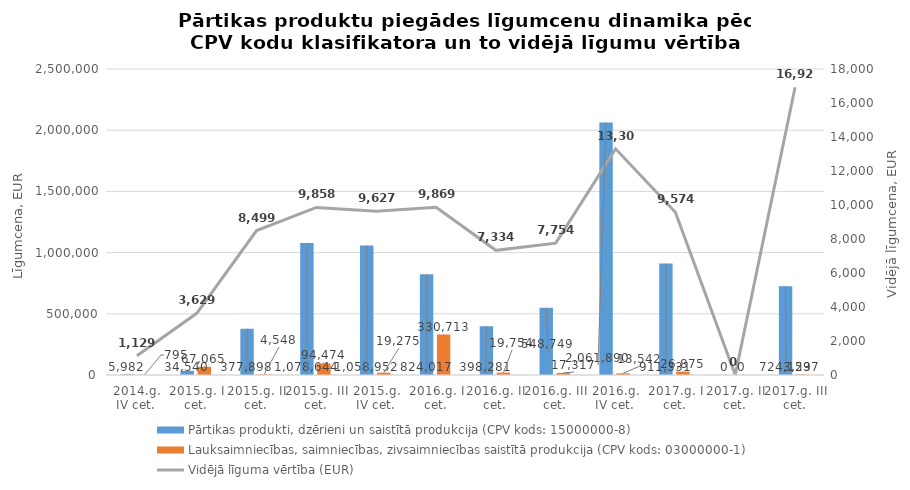
| Category | Pārtikas produkti, dzērieni un saistītā produkcija (CPV kods: 15000000-8) | Lauksaimniecības, saimniecības, zivsaimniecības saistītā produkcija (CPV kods: 03000000-1) |
|---|---|---|
| 2014.g. IV cet. | 5982 | 795 |
| 2015.g. I cet. | 34540 | 67065 |
| 2015.g. II cet. | 377898 | 4548 |
| 2015.g. III cet. | 1078644 | 94474 |
| 2015.g. IV cet. | 1058952 | 19275 |
| 2016.g. I cet. | 824017 | 330713 |
| 2016.g. II cet. | 398281 | 19754 |
| 2016.g. III cet. | 548749.01 | 17317 |
| 2016.g. IV cet. | 2061890 | 13542 |
| 2017.g. I cet. | 911330.81 | 26874.91 |
| 2017.g. II cet. | 0 | 0 |
| 2017.g. III cet. | 724123.07 | 3596.6 |